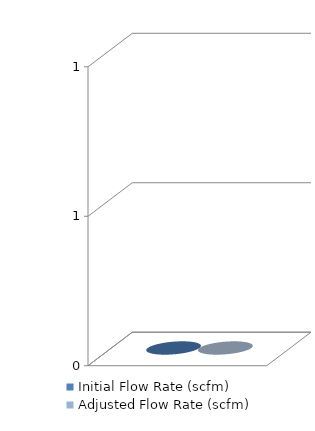
| Category | Initial Flow Rate (scfm) | Adjusted Flow Rate (scfm) |
|---|---|---|
| 0 | 0 | 0 |